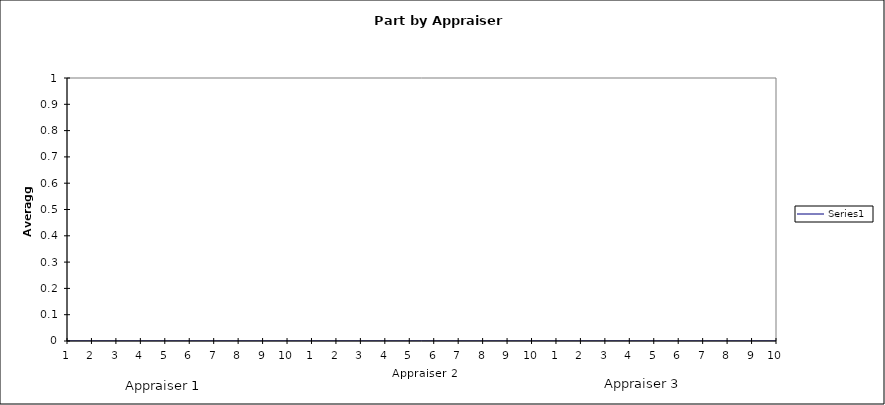
| Category | Series 0 | UCL | XCL | LCL |
|---|---|---|---|---|
| 1 | 0 |  |  |  |
| 2 | 0 |  |  |  |
| 3 | 0 |  |  |  |
| 4 | 0 |  |  |  |
| 5 | 0 |  |  |  |
| 6 | 0 |  |  |  |
| 7 | 0 |  |  |  |
| 8 | 0 |  |  |  |
| 9 | 0 |  |  |  |
| 10 | 0 |  |  |  |
| 1 | 0 |  |  |  |
| 2 | 0 |  |  |  |
| 3 | 0 |  |  |  |
| 4 | 0 |  |  |  |
| 5 | 0 |  |  |  |
| 6 | 0 |  |  |  |
| 7 | 0 |  |  |  |
| 8 | 0 |  |  |  |
| 9 | 0 |  |  |  |
| 10 | 0 |  |  |  |
| 1 | 0 |  |  |  |
| 2 | 0 |  |  |  |
| 3 | 0 |  |  |  |
| 4 | 0 |  |  |  |
| 5 | 0 |  |  |  |
| 6 | 0 |  |  |  |
| 7 | 0 |  |  |  |
| 8 | 0 |  |  |  |
| 9 | 0 |  |  |  |
| 10 | 0 |  |  |  |